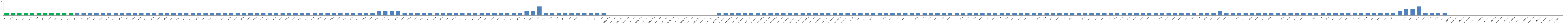
| Category | Series 0 |
|---|---|
| AW01 | 1 |
| AW02 | 1 |
| AW03 | 1 |
| AW04 | 1 |
| AW05 | 1 |
| AW06 | 1 |
| AW07 | 1 |
| AW08 | 1 |
| AW09 | 1 |
| AW10 | 1 |
| AW11 | 1 |
| AW12 | 1 |
| AW13 | 1 |
| AW14 | 1 |
| AW15 | 1 |
| AW16 | 1 |
| AW17 | 1 |
| AW18 | 1 |
| AW19 | 1 |
| AW20 | 1 |
| AW21 | 1 |
| AW22 | 1 |
| AW23 | 1 |
| AW24 | 1 |
| AW25 | 1 |
| AW26 | 1 |
| AW27 | 1 |
| AW28 | 1 |
| AW29 | 1 |
| BW01 | 1 |
| BW02 | 1 |
| BW03 | 1 |
| BWO4 | 1 |
| BW05 | 1 |
| BW06 | 1 |
| BW07 | 1 |
| BW08 | 1 |
| BW09 | 1 |
| BW10 | 1 |
| BW11 | 1 |
| BW12 | 1 |
| BW13 | 1 |
| BW14 | 1 |
| BW15 | 1 |
| BW16 | 1 |
| BW17 | 1 |
| BW18 | 1 |
| BW19 | 1 |
| BW20 | 1 |
| BW21 | 1 |
| BW22 | 1 |
| BW23 | 1 |
| BW24 | 1 |
| BW25 | 1 |
| BW26 | 1 |
| BW27 | 1 |
| BW28 | 1 |
| BW29 | 1 |
| BW30 | 2 |
| BW31 | 2 |
| BW32 | 2 |
| BW33 | 2 |
| BW34 | 1 |
| BW35 | 1 |
| BW36 | 1 |
| BW37 | 1 |
| BW38 | 1 |
| BW39 | 1 |
| BW40 | 1 |
| BW41 | 1 |
| BW42 | 1 |
| BW43 | 1 |
| BW44 | 1 |
| BW45 | 1 |
| BW46 | 1 |
| BW47 | 1 |
| BW48 | 1 |
| BW49 | 1 |
| BW50 | 1 |
| BW51 | 1 |
| BW52 | 1 |
| CW01 | 2 |
| CW02 | 2 |
| CW03 | 4 |
| CW04 | 1 |
| CW05 | 1 |
| CW06 | 1 |
| CW07 | 1 |
| CW08 | 1 |
| CW09 | 1 |
| CW10 | 1 |
| CW11 | 1 |
| CW12 | 1 |
| CW13 | 1 |
| AUMED. W01 | 0 |
| AUMED. W02 | 0 |
| AUMED. W03 | 0 |
| AUMED. W04 | 0 |
| AUMED. W05 | 0 |
| AUMED. W06 | 0 |
| AUMED. W07 | 0 |
| AUMED. W08 | 0 |
| AUMED.W09 | 0 |
| AUMED. W10 | 0 |
| AUMED. W11 | 0 |
| AUMED. W12 | 0 |
| AUMED. W13 | 0 |
| AUMED. W14 | 0 |
| AUMED. W15 | 0 |
| AUMED. W16 | 0 |
| AUMED. W17 | 0 |
| BUMED.W01 | 1 |
| BUMED.W02 | 1 |
| BUMED.W03 | 1 |
| BUMED.W04 | 1 |
| BUMED.W05 | 1 |
| BUMED.W06 | 1 |
| BUMED.W07 | 1 |
| BUMED.W08 | 1 |
| BUMED.W09 | 1 |
| BUMED.W10 | 1 |
| BUMED.W11 | 1 |
| BUMED.W12 | 1 |
| BUMED.W13 | 1 |
| BUMED.W14 | 1 |
| BUMED.W15 | 1 |
| BUMED.W16 | 1 |
| BUMED.W17 | 1 |
| BUMED.W18 | 1 |
| BUMED.W19 | 1 |
| BUMED.W20 | 1 |
| BUMED.W21 | 1 |
| AW22* | 1 |
| AW23* | 1 |
| AW24* | 1 |
| AW25* | 1 |
| AU01 | 1 |
| AU02 | 1 |
| AU03 | 1 |
| AU04 | 1 |
| AU05 | 1 |
| AU06 | 1 |
| AU07 | 1 |
| AU08 | 1 |
| AU09 | 1 |
| AU10 | 1 |
| AU11 | 1 |
| AU12 | 1 |
| AU13 | 1 |
| AU14 | 1 |
| AU15 | 1 |
| AU16 | 1 |
| AU17 | 1 |
| AU18 | 1 |
| AU19 | 1 |
| AU20 | 1 |
| AU21 | 1 |
| BU01 | 1 |
| BU02 | 1 |
| BU03 | 1 |
| BU04 | 1 |
| BU05 | 1 |
| BU06 | 1 |
| BU07 | 1 |
| BU08 | 1 |
| BU09 | 1 |
| BU10 | 1 |
| BU11 | 1 |
| BU12 | 1 |
| BU13 | 1 |
| BU14 | 1 |
| BU15 | 1 |
| BU16 | 1 |
| BU17 | 1 |
| BU18 | 1 |
| BU19 | 1 |
| BU20 | 1 |
| BU21 | 1 |
| BU22 | 1 |
| BU23 | 1 |
| BU24 | 1 |
| BU25 | 1 |
| BU26 | 1 |
| BU27 | 1 |
| BU28 | 1 |
| BU29 | 1 |
| BU30 | 1 |
| BU31 | 1 |
| BU32 | 1 |
| BU33 | 2 |
| BU34 | 1 |
| BU35 | 1 |
| BU36 | 1 |
| BU37 | 1 |
| BU38 | 1 |
| BU39 | 1 |
| BU40 | 1 |
| BU41 | 1 |
| BU42 | 1 |
| BU43 | 1 |
| BU44 | 1 |
| BU45 | 1 |
| BU46 | 1 |
| BU47 | 1 |
| BU48 | 1 |
| BU49 | 1 |
| BU50 | 1 |
| BU51 | 1 |
| BU52 | 1 |
| BU53 | 1 |
| BU54 | 1 |
| BU55 | 1 |
| BU56 | 1 |
| BU57 | 1 |
| BU58 | 1 |
| BU59 | 1 |
| BU60 | 1 |
| BU61 | 2 |
| CU01 | 3 |
| CU02 | 3 |
| CU03 | 4 |
| CU04 | 1 |
| CU05 | 1 |
| CU06 | 1 |
| CU07 | 1 |
| AUMED.U01 | 0 |
| AUMED.U02 | 0 |
| AUMED.U03 | 0 |
| AUMED.U04 | 0 |
| AUMED.U05 | 0 |
| AUMED.U06 | 0 |
| AUMED.U07 | 0 |
| AUMED.U08 | 0 |
| AUMED.U09 | 0 |
| AUMED.U10 | 0 |
| AUMED.U11 | 0 |
| AUMED.U12 | 0 |
| AUMED.U13 | 0 |
| AUMED.U14 | 0 |
| AUMED.U15 | 0 |
| AUMED.U16 | 0 |
| AUMED.U17 | 0 |
| AUMED.U18 | 0 |